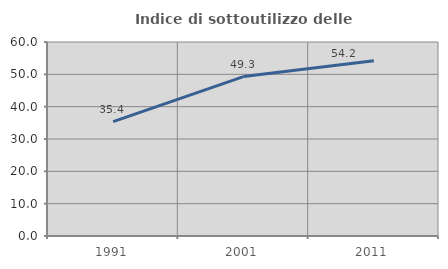
| Category | Indice di sottoutilizzo delle abitazioni  |
|---|---|
| 1991.0 | 35.378 |
| 2001.0 | 49.306 |
| 2011.0 | 54.172 |